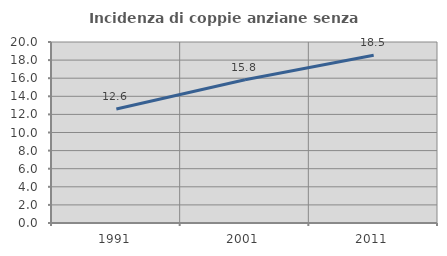
| Category | Incidenza di coppie anziane senza figli  |
|---|---|
| 1991.0 | 12.595 |
| 2001.0 | 15.825 |
| 2011.0 | 18.543 |